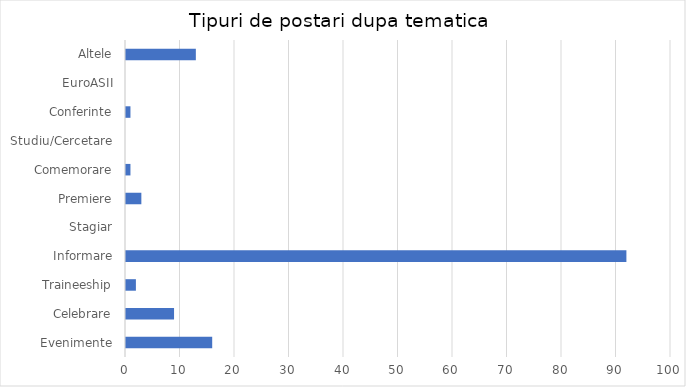
| Category | Series 0 |
|---|---|
| Evenimente | 16 |
| Celebrare | 9 |
| Traineeship | 2 |
| Informare | 92 |
| Stagiar | 0 |
| Premiere | 3 |
| Comemorare | 1 |
| Studiu/Cercetare | 0 |
| Conferinte | 1 |
| EuroASII | 0 |
| Altele | 13 |